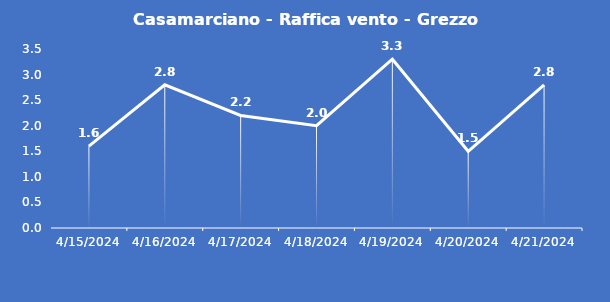
| Category | Casamarciano - Raffica vento - Grezzo (m/s) |
|---|---|
| 4/15/24 | 1.6 |
| 4/16/24 | 2.8 |
| 4/17/24 | 2.2 |
| 4/18/24 | 2 |
| 4/19/24 | 3.3 |
| 4/20/24 | 1.5 |
| 4/21/24 | 2.8 |